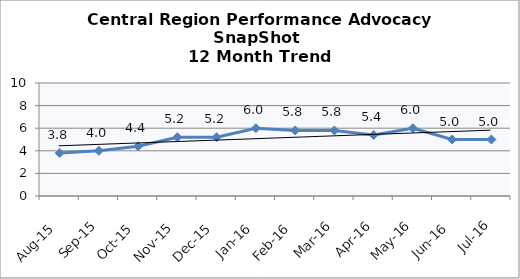
| Category | Central Region |
|---|---|
| Aug-15 | 3.8 |
| Sep-15 | 4 |
| Oct-15 | 4.4 |
| Nov-15 | 5.2 |
| Dec-15 | 5.2 |
| Jan-16 | 6 |
| Feb-16 | 5.8 |
| Mar-16 | 5.8 |
| Apr-16 | 5.4 |
| May-16 | 6 |
| Jun-16 | 5 |
| Jul-16 | 5 |